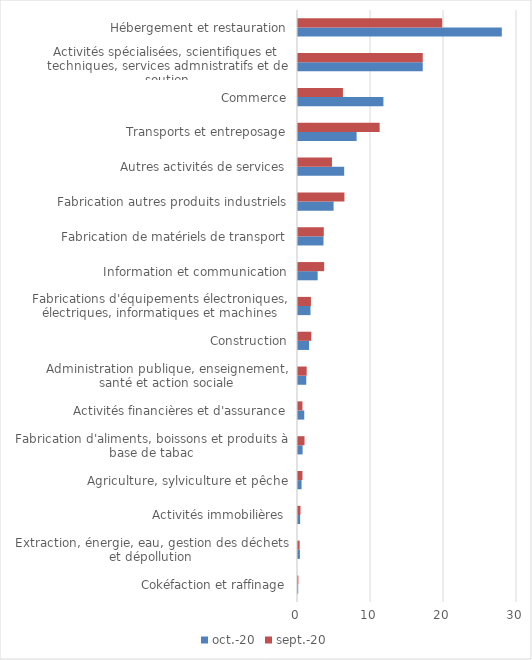
| Category | oct.-20 | sept.-20 |
|---|---|---|
| Cokéfaction et raffinage | 0.025 | 0.056 |
| Extraction, énergie, eau, gestion des déchets et dépollution | 0.259 | 0.224 |
| Activités immobilières | 0.292 | 0.338 |
| Agriculture, sylviculture et pêche | 0.488 | 0.609 |
| Fabrication d'aliments, boissons et produits à base de tabac | 0.629 | 0.892 |
| Activités financières et d'assurance | 0.855 | 0.608 |
| Administration publique, enseignement, santé et action sociale | 1.129 | 1.189 |
| Construction | 1.517 | 1.819 |
| Fabrications d'équipements électroniques, électriques, informatiques et machines | 1.713 | 1.771 |
| Information et communication | 2.692 | 3.584 |
| Fabrication de matériels de transport | 3.491 | 3.533 |
| Fabrication autres produits industriels | 4.876 | 6.36 |
| Autres activités de services | 6.326 | 4.649 |
| Transports et entreposage | 8.029 | 11.184 |
| Commerce | 11.7 | 6.153 |
| Activités spécialisées, scientifiques et techniques, services admnistratifs et de soutien | 17.086 | 17.087 |
| Hébergement et restauration | 27.92 | 19.752 |